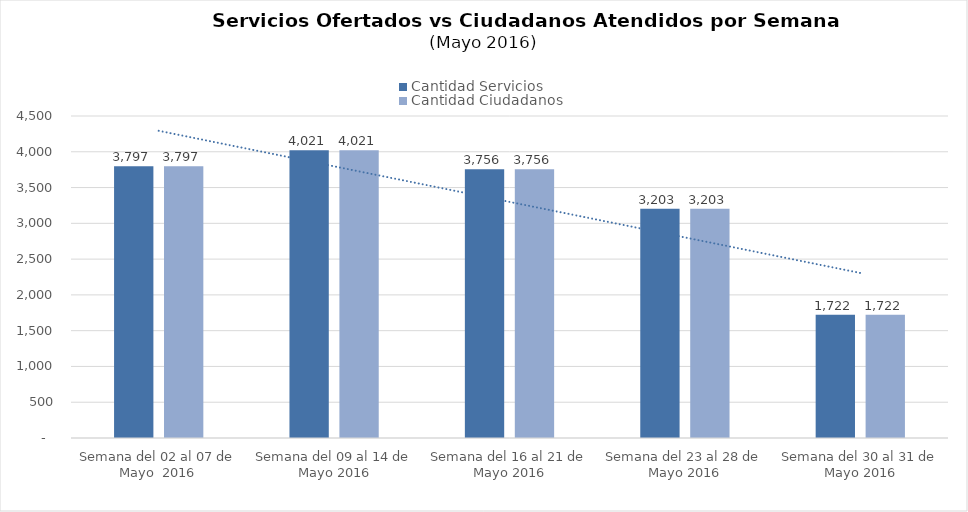
| Category | Cantidad Servicios | Cantidad Ciudadanos |
|---|---|---|
| Semana del 02 al 07 de Mayo  2016 | 3797 | 3797 |
| Semana del 09 al 14 de Mayo 2016 | 4021 | 4021 |
| Semana del 16 al 21 de Mayo 2016 | 3756 | 3756 |
| Semana del 23 al 28 de Mayo 2016 | 3203 | 3203 |
| Semana del 30 al 31 de Mayo 2016 | 1722 | 1722 |